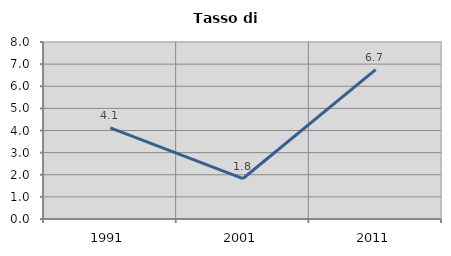
| Category | Tasso di disoccupazione   |
|---|---|
| 1991.0 | 4.118 |
| 2001.0 | 1.829 |
| 2011.0 | 6.748 |